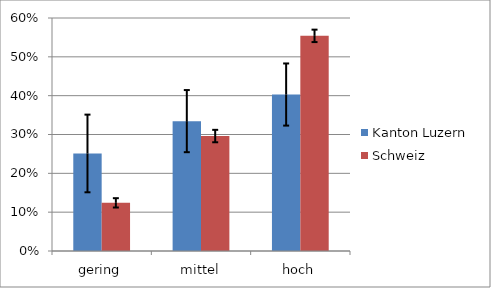
| Category | Kanton Luzern  | Schweiz |
|---|---|---|
| gering | 0.251 | 0.124 |
| mittel | 0.334 | 0.296 |
| hoch | 0.403 | 0.554 |